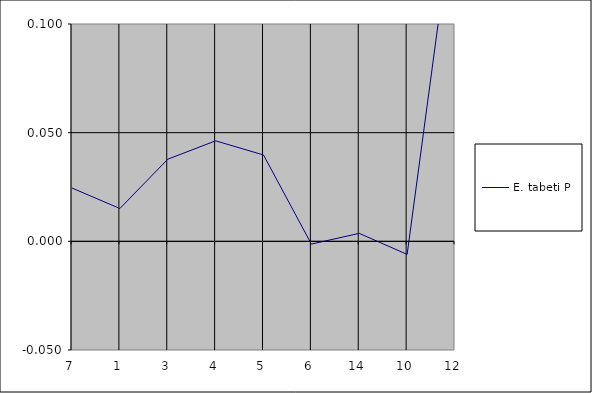
| Category | E. tabeti P |
|---|---|
| 7.0 | 0.025 |
| 1.0 | 0.015 |
| 3.0 | 0.038 |
| 4.0 | 0.046 |
| 5.0 | 0.04 |
| 6.0 | -0.001 |
| 14.0 | 0.004 |
| 10.0 | -0.006 |
| 12.0 | 0.158 |